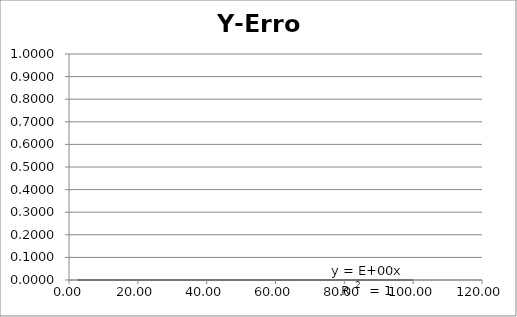
| Category | Error |
|---|---|
| 2.5 | 0 |
| 12.5 | 0 |
| 18.0 | 0 |
| 30.0 | 0 |
| 60.0 | 0 |
| 100.0 | 0 |